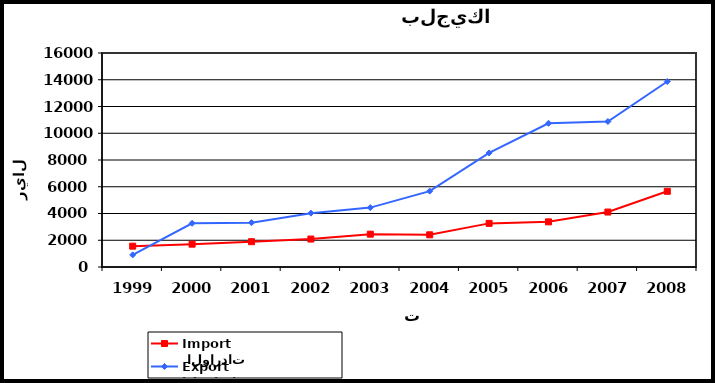
| Category |  الواردات           Import | الصادرات          Export |
|---|---|---|
| 1999.0 | 1558 | 907 |
| 2000.0 | 1707 | 3267 |
| 2001.0 | 1892 | 3314 |
| 2002.0 | 2089 | 4027 |
| 2003.0 | 2454 | 4440 |
| 2004.0 | 2407 | 5673 |
| 2005.0 | 3261 | 8528 |
| 2006.0 | 3376 | 10746 |
| 2007.0 | 4109 | 10877 |
| 2008.0 | 5660 | 13867 |